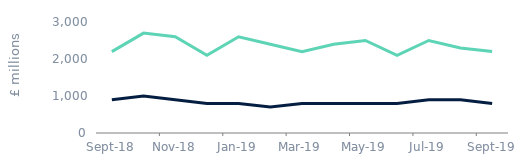
| Category | House purchase | Remortgage |
|---|---|---|
| 2018-09-01 | 900 | 2200 |
| 2018-10-01 | 1000 | 2700 |
| 2018-11-01 | 900 | 2600 |
| 2018-12-01 | 800 | 2100 |
| 2019-01-01 | 800 | 2600 |
| 2019-02-01 | 700 | 2400 |
| 2019-03-01 | 800 | 2200 |
| 2019-04-01 | 800 | 2400 |
| 2019-05-01 | 800 | 2500 |
| 2019-06-01 | 800 | 2100 |
| 2019-07-01 | 900 | 2500 |
| 2019-08-01 | 900 | 2300 |
| 2019-09-01 | 800 | 2200 |